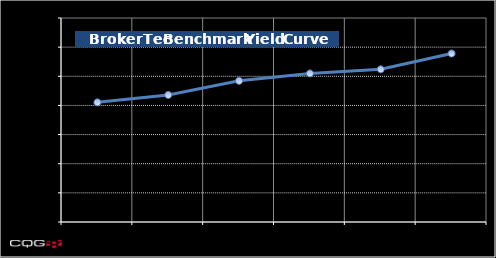
| Category | Series 0 |
|---|---|
| BUS02Y | 2.053 |
| BUS03Y | 2.18 |
| BUS05Y | 2.422 |
| BUS07Y | 2.549 |
| BUS010Y | 2.62 |
| BUS030Y | 2.891 |